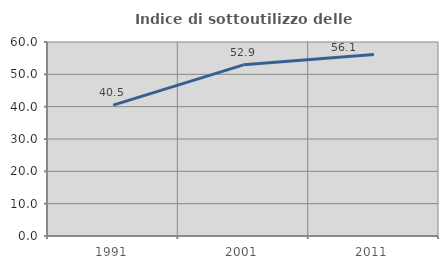
| Category | Indice di sottoutilizzo delle abitazioni  |
|---|---|
| 1991.0 | 40.476 |
| 2001.0 | 52.941 |
| 2011.0 | 56.122 |